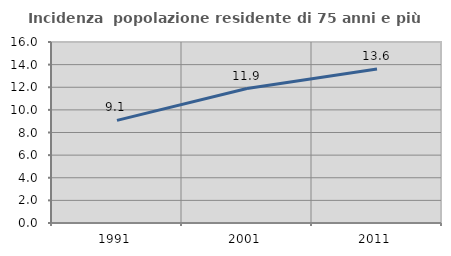
| Category | Incidenza  popolazione residente di 75 anni e più |
|---|---|
| 1991.0 | 9.074 |
| 2001.0 | 11.887 |
| 2011.0 | 13.619 |